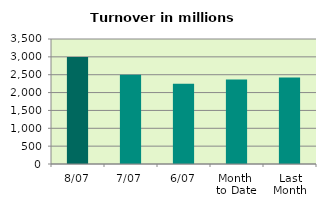
| Category | Series 0 |
|---|---|
| 8/07 | 2993.438 |
| 7/07 | 2496.274 |
| 6/07 | 2246.517 |
| Month 
to Date | 2366.28 |
| Last
Month | 2424.747 |